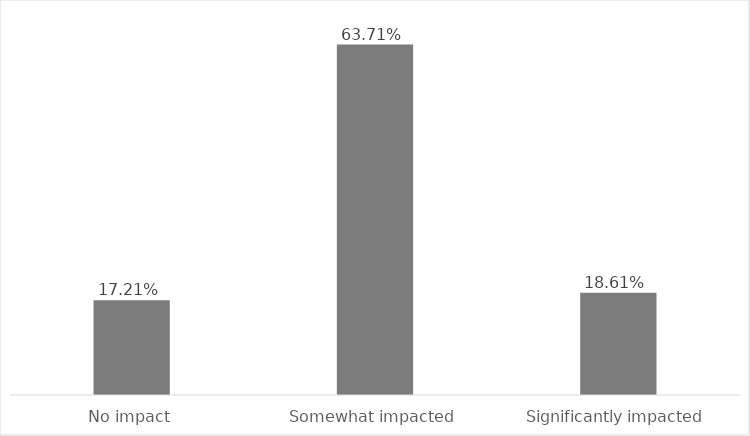
| Category | Series 0 |
|---|---|
| No impact | 0.172 |
| Somewhat impacted | 0.637 |
| Significantly impacted | 0.186 |